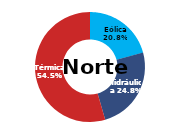
| Category | Norte |
|---|---|
| Eólica | 75.066 |
| Hidráulica | 89.433 |
| Solar | 0 |
| Térmica | 196.722 |